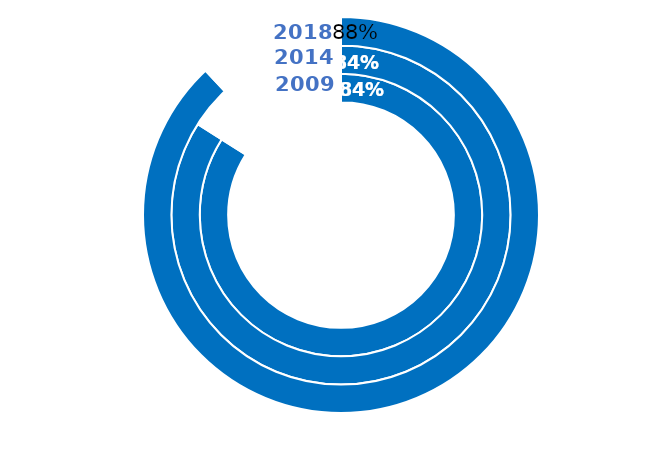
| Category | 2009 | 2014 | 2018 |
|---|---|---|---|
| Plutôt d'accord | 84 | 84 | 88 |